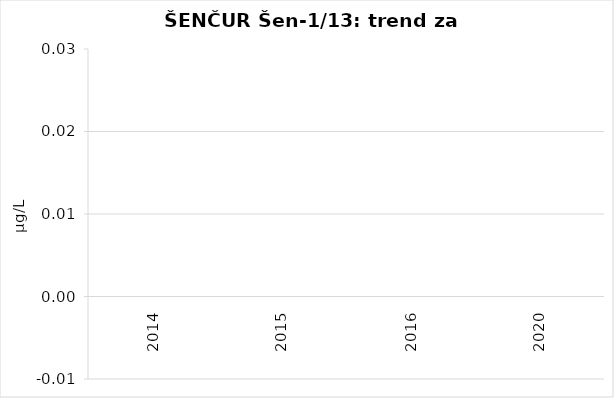
| Category | Vsota |
|---|---|
| 2014 | 0 |
| 2015 | 0 |
| 2016 | 0 |
| 2020 | 0 |